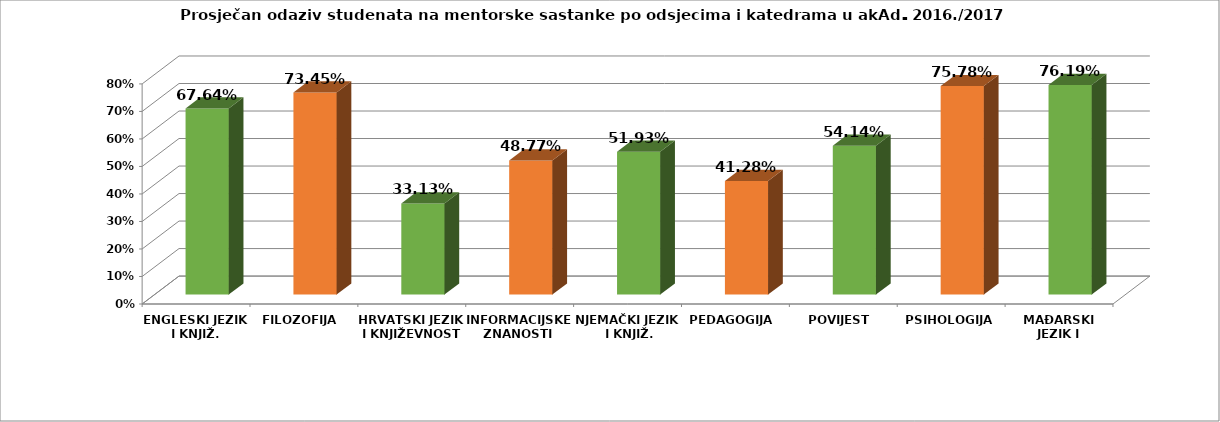
| Category | Series 0 |
|---|---|
| ENGLESKI JEZIK I KNJIŽ. | 0.676 |
| FILOZOFIJA  | 0.734 |
| HRVATSKI JEZIK I KNJIŽEVNOST | 0.331 |
| INFORMACIJSKE ZNANOSTI  | 0.488 |
| NJEMAČKI JEZIK I KNJIŽ. | 0.519 |
| PEDAGOGIJA  | 0.413 |
| POVIJEST  | 0.541 |
| PSIHOLOGIJA | 0.758 |
| MAĐARSKI JEZIK I KNJIŽEVNOST | 0.762 |